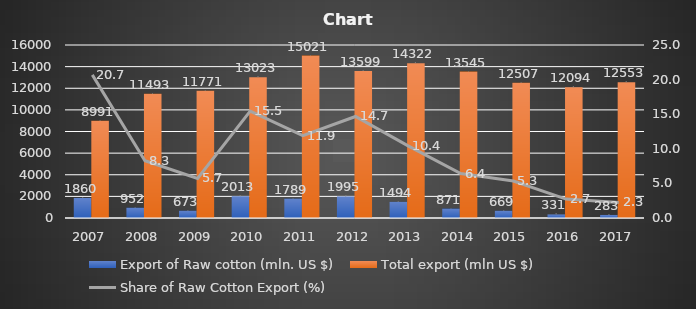
| Category | Export of Raw cotton (mln. US $) | Total export (mln US $) |
|---|---|---|
| 2007.0 | 1860 | 8991 |
| 2008.0 | 952 | 11493 |
| 2009.0 | 673 | 11771 |
| 2010.0 | 2013 | 13023 |
| 2011.0 | 1789 | 15021 |
| 2012.0 | 1995 | 13599 |
| 2013.0 | 1494 | 14322 |
| 2014.0 | 871 | 13545 |
| 2015.0 | 669 | 12507 |
| 2016.0 | 331 | 12094 |
| 2017.0 | 283 | 12553 |